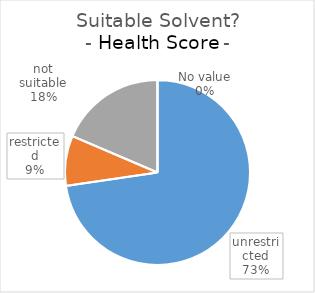
| Category | Series 0 |
|---|---|
| unrestricted | 133 |
| restricted | 16 |
| not suitable | 34 |
| No value | 0 |